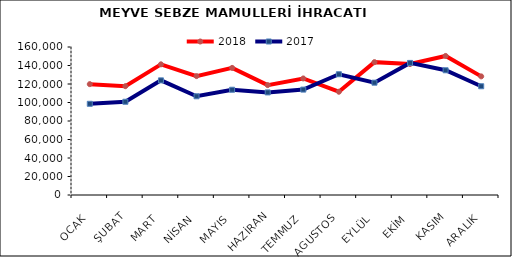
| Category | 2018 | 2017 |
|---|---|---|
| OCAK | 119846.299 | 98588.703 |
| ŞUBAT | 117642.806 | 100801.502 |
| MART | 141260.954 | 123925.278 |
| NİSAN | 128538.276 | 106737.598 |
| MAYIS | 137415.058 | 113793.929 |
| HAZİRAN | 118811.437 | 110904.229 |
| TEMMUZ | 125990.456 | 113949.225 |
| AGUSTOS | 111637.652 | 130550.48 |
| EYLÜL | 143645.049 | 121419.573 |
| EKİM | 141557.73 | 142803.856 |
| KASIM | 150333.711 | 134831.496 |
| ARALIK | 128241.204 | 117563.228 |